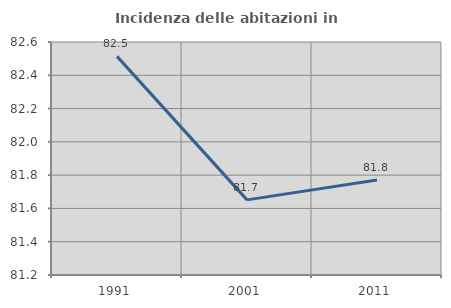
| Category | Incidenza delle abitazioni in proprietà  |
|---|---|
| 1991.0 | 82.514 |
| 2001.0 | 81.651 |
| 2011.0 | 81.771 |